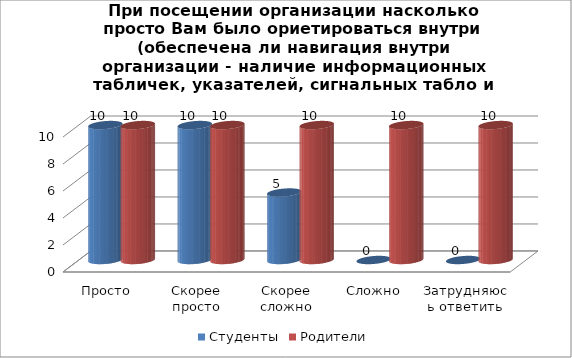
| Category | Студенты | Родители |
|---|---|---|
| Просто | 10 | 10 |
| Скорее просто | 10 | 10 |
| Скорее сложно | 5 | 10 |
| Сложно | 0 | 10 |
| Затрудняюсь ответить | 0 | 10 |